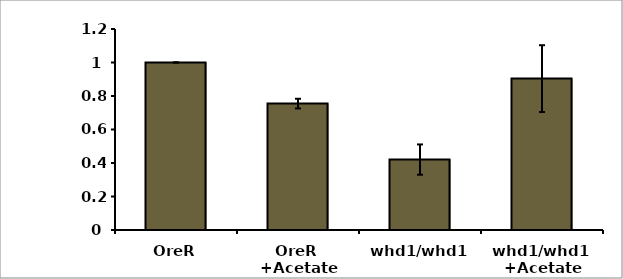
| Category | Series 0 |
|---|---|
| OreR | 1 |
| OreR  +Acetate | 0.755 |
| whd1/whd1 | 0.42 |
| whd1/whd1  +Acetate | 0.904 |